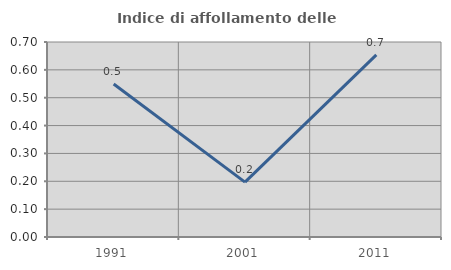
| Category | Indice di affollamento delle abitazioni  |
|---|---|
| 1991.0 | 0.549 |
| 2001.0 | 0.197 |
| 2011.0 | 0.654 |